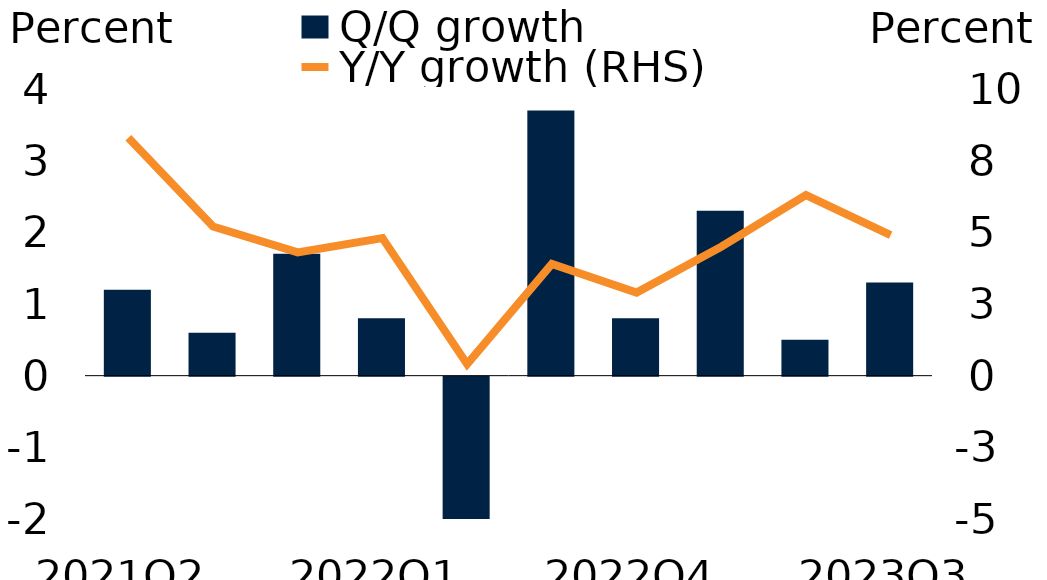
| Category | Q/Q growth |
|---|---|
| 2021Q2 | 1.2 |
| 2021Q3 | 0.6 |
| 2021Q4 | 1.7 |
| 2022Q1 | 0.8 |
| 2022Q2 | -2.3 |
| 2022Q3 | 3.7 |
| 2022Q4 | 0.8 |
| 2023Q1 | 2.3 |
| 2023Q2 | 0.5 |
| 2023Q3 | 1.3 |